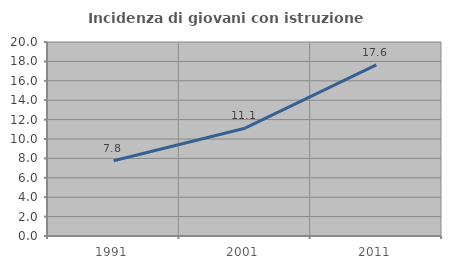
| Category | Incidenza di giovani con istruzione universitaria |
|---|---|
| 1991.0 | 7.752 |
| 2001.0 | 11.111 |
| 2011.0 | 17.647 |